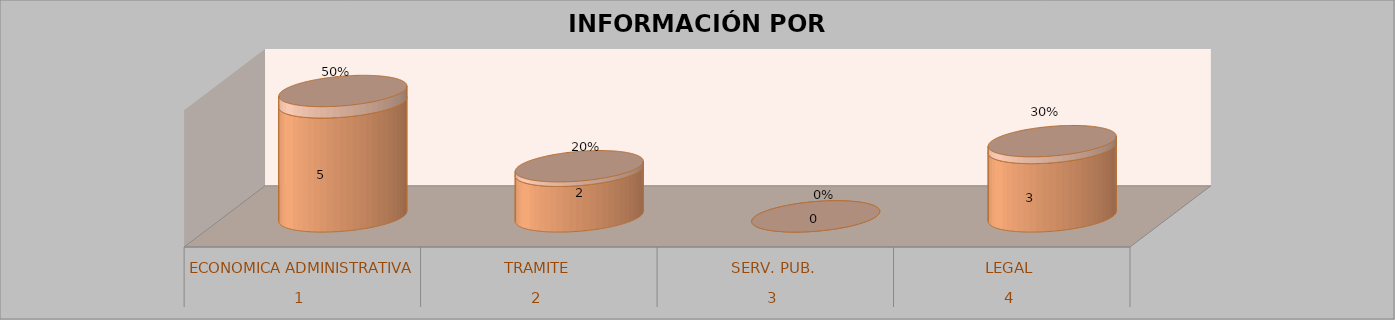
| Category | Series 0 | Series 1 | Series 2 | Series 3 |
|---|---|---|---|---|
| 0 |  |  | 5 | 0.5 |
| 1 |  |  | 2 | 0.2 |
| 2 |  |  | 0 | 0 |
| 3 |  |  | 3 | 0.3 |